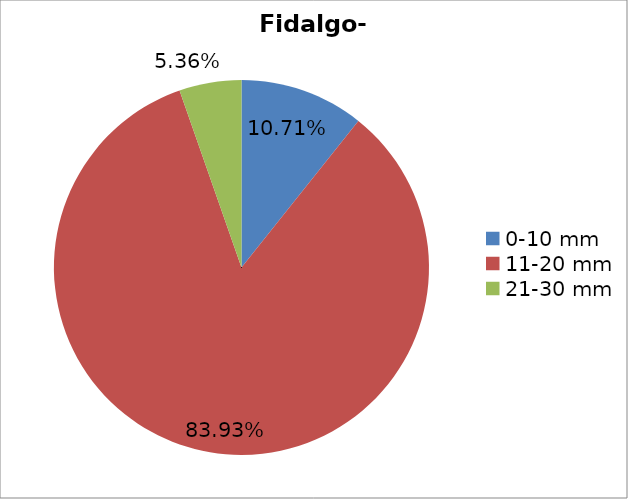
| Category | Series 0 |
|---|---|
| 0-10 mm | 0.107 |
| 11-20 mm | 0.839 |
| 21-30 mm | 0.054 |